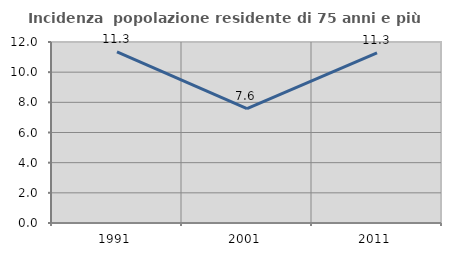
| Category | Incidenza  popolazione residente di 75 anni e più |
|---|---|
| 1991.0 | 11.346 |
| 2001.0 | 7.586 |
| 2011.0 | 11.282 |